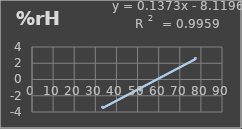
| Category | Humedad |
|---|---|
| 33.4 | -3.4 |
| 51.3 | -1.3 |
| 77.4 | 2.6 |